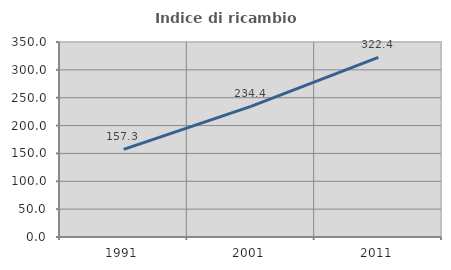
| Category | Indice di ricambio occupazionale  |
|---|---|
| 1991.0 | 157.303 |
| 2001.0 | 234.426 |
| 2011.0 | 322.449 |